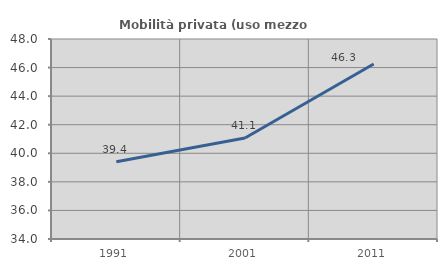
| Category | Mobilità privata (uso mezzo privato) |
|---|---|
| 1991.0 | 39.412 |
| 2001.0 | 41.065 |
| 2011.0 | 46.25 |